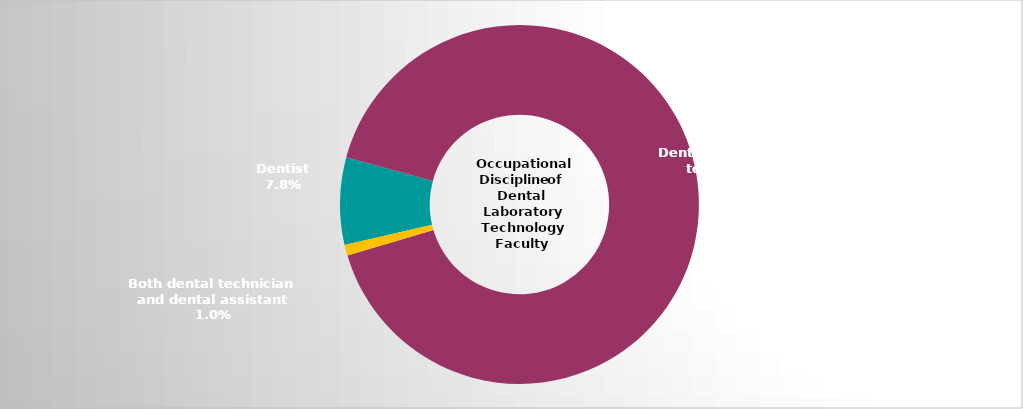
| Category | Series 2 |
|---|---|
| Dentist | 0.078 |
| Dental laboratory technician | 0.912 |
| Both dental technician and dental assistant | 0.01 |